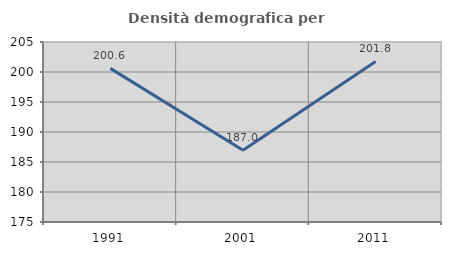
| Category | Densità demografica |
|---|---|
| 1991.0 | 200.601 |
| 2001.0 | 186.975 |
| 2011.0 | 201.757 |